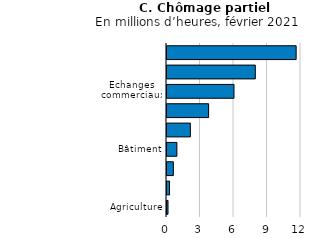
| Category | Février 2021 |
|---|---|
| Agriculture | 89972 |
| Activités financières et d’assurances | 228054 |
| Information et communication | 569755 |
| Bâtiment | 884838 |
| Transports | 2091780 |
| Industries extractives et 
manufacturières et services d’utilité publique | 3727462 |
| Échanges commerciaux | 5998867 |
| Autres services | 7908859 |
| Activités d'hébergement
 et de restauration | 11565796 |